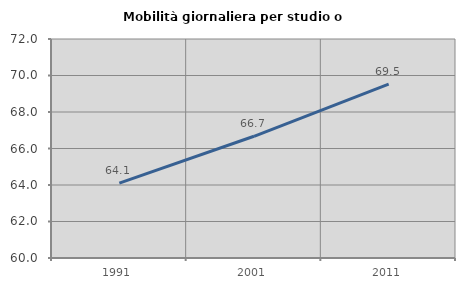
| Category | Mobilità giornaliera per studio o lavoro |
|---|---|
| 1991.0 | 64.107 |
| 2001.0 | 66.67 |
| 2011.0 | 69.531 |